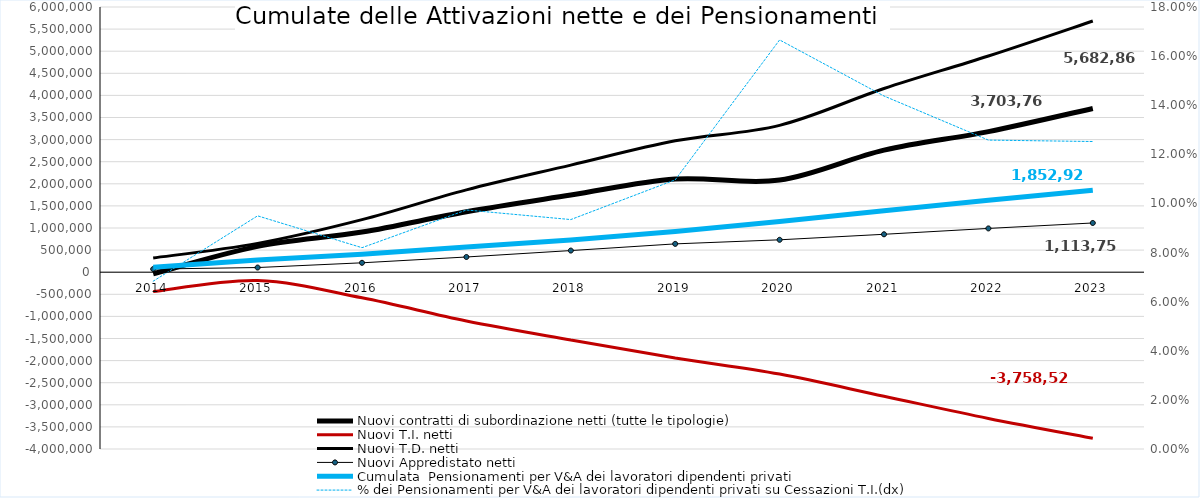
| Category | Nuovi contratti di subordinazione netti (tutte le tipologie) | Nuovi T.I. netti  | Nuovi T.D. netti  | Nuovi Appredistato netti | Cumulata  Pensionamenti per V&A dei lavoratori dipendenti privati |
|---|---|---|---|---|---|
| 2014.0 | -36974 | -438794 | 322226 | 70777 | 113074 |
| 2015.0 | 583812 | -188574 | 652640 | 105463 | 274747 |
| 2016.0 | 907890 | -579988 | 1189143 | 212516 | 407965 |
| 2017.0 | 1367093 | -1103186 | 1863165 | 344088 | 569817 |
| 2018.0 | 1745137 | -1532573 | 2422057 | 489236 | 727541 |
| 2019.0 | 2108046 | -1940397 | 2972810 | 640833 | 920637 |
| 2020.0 | 2084110 | -2305143 | 3322574 | 732989 | 1149251 |
| 2021.0 | 2761088 | -2806507 | 4155605 | 857549 | 1389157 |
| 2022.0 | 3180714 | -3309065 | 4891678 | 990388 | 1627129 |
| 2023.0 | 3703765 | -3758525 | 5682867 | 1113751 | 1852925 |